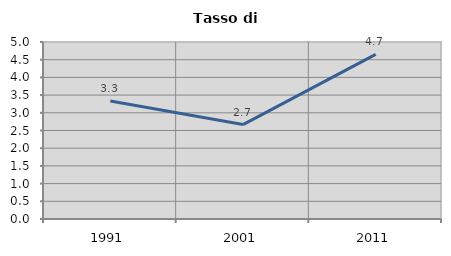
| Category | Tasso di disoccupazione   |
|---|---|
| 1991.0 | 3.333 |
| 2001.0 | 2.667 |
| 2011.0 | 4.651 |